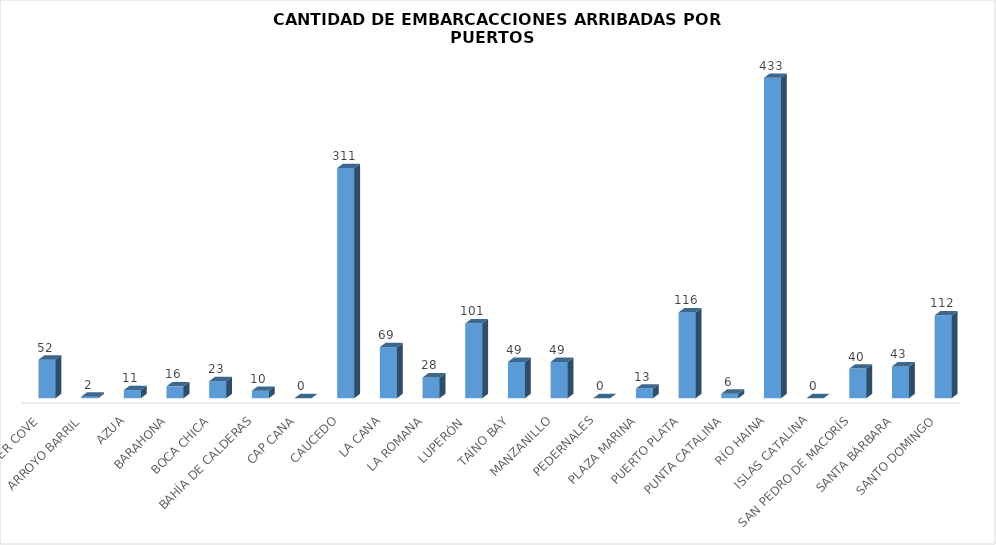
| Category | Series 0 |
|---|---|
| AMBER COVE | 52 |
| ARROYO BARRIL | 2 |
| AZUA | 11 |
| BARAHONA | 16 |
| BOCA CHICA | 23 |
| BAHÍA DE CALDERAS | 10 |
| CAP CANA | 0 |
| CAUCEDO | 311 |
| LA CANA | 69 |
| LA ROMANA | 28 |
| LUPERÓN  | 101 |
| TAÍNO BAY | 49 |
| MANZANILLO | 49 |
| PEDERNALES | 0 |
| PLAZA MARINA | 13 |
| PUERTO PLATA | 116 |
| PUNTA CATALINA | 6 |
| RÍO HAINA | 433 |
| ISLAS CATALINA | 0 |
| SAN PEDRO DE MACORÍS | 40 |
| SANTA BÁRBARA | 43 |
| SANTO DOMINGO | 112 |